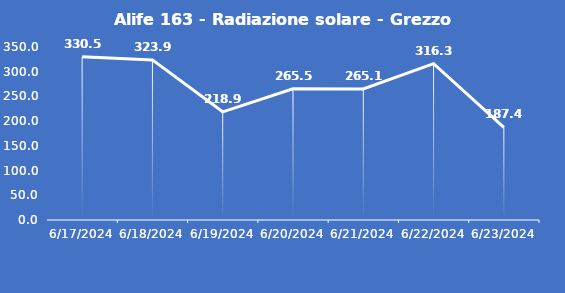
| Category | Alife 163 - Radiazione solare - Grezzo (W/m2) |
|---|---|
| 6/17/24 | 330.5 |
| 6/18/24 | 323.9 |
| 6/19/24 | 218.9 |
| 6/20/24 | 265.5 |
| 6/21/24 | 265.1 |
| 6/22/24 | 316.3 |
| 6/23/24 | 187.4 |